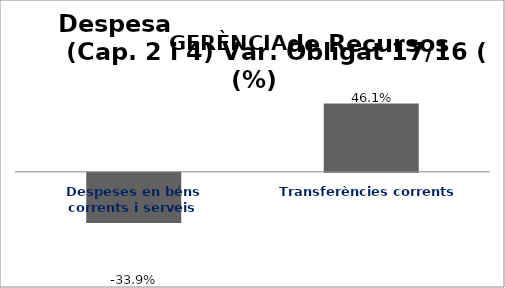
| Category | Series 0 |
|---|---|
| Despeses en béns corrents i serveis | -0.339 |
| Transferències corrents | 0.461 |